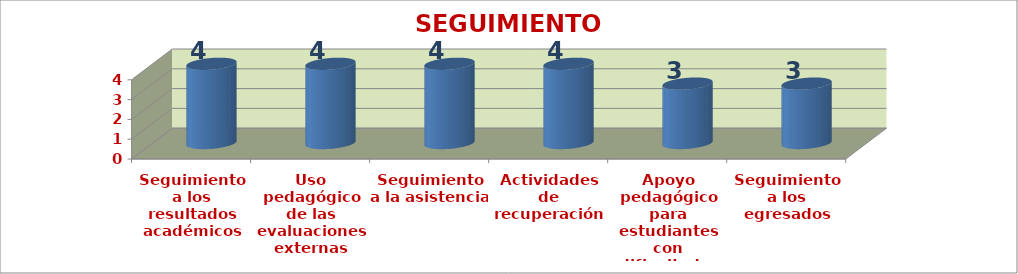
| Category | SEGUIMIENTO ECADÉMICO |
|---|---|
| Seguimiento a los resultados
académicos | 4 |
| Uso pedagógico de las
evaluaciones externas | 4 |
| Seguimiento a la asistencia | 4 |
| Actividades de recuperación | 4 |
| Apoyo pedagógico para
estudiantes con dificultades de
aprendizaje | 3 |
| Seguimiento a los egresados | 3 |